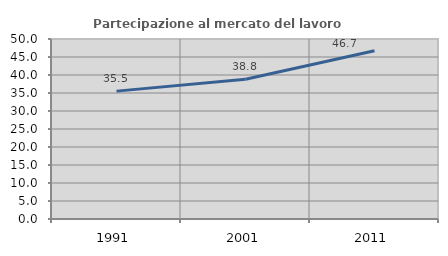
| Category | Partecipazione al mercato del lavoro  femminile |
|---|---|
| 1991.0 | 35.519 |
| 2001.0 | 38.839 |
| 2011.0 | 46.735 |